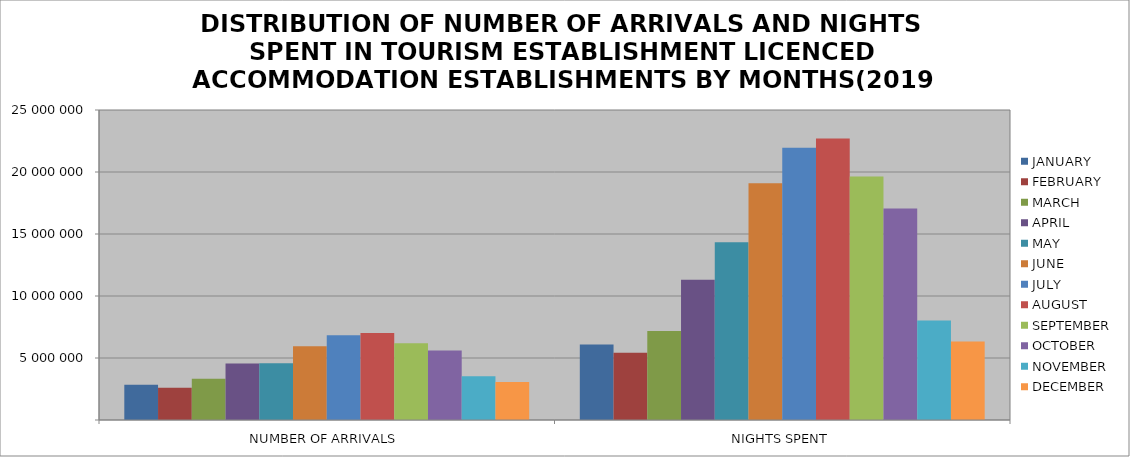
| Category | JANUARY | FEBRUARY | MARCH | APRIL | MAY | JUNE | JULY | AUGUST | SEPTEMBER | OCTOBER | NOVEMBER | DECEMBER |
|---|---|---|---|---|---|---|---|---|---|---|---|---|
| NUMBER OF ARRIVALS | 2833509 | 2607189 | 3326719 | 4561709 | 4585981 | 5949977 | 6830740 | 7020795 | 6189605 | 5614434 | 3537887 | 3055832 |
| NIGHTS SPENT | 6098050 | 5425989 | 7182593 | 11302946 | 14338328 | 19092571 | 21955256 | 22706728 | 19635859 | 17054807 | 8015568 | 6340289 |